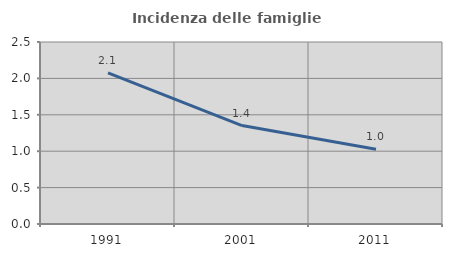
| Category | Incidenza delle famiglie numerose |
|---|---|
| 1991.0 | 2.077 |
| 2001.0 | 1.352 |
| 2011.0 | 1.027 |